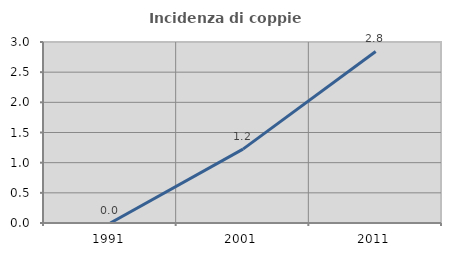
| Category | Incidenza di coppie miste |
|---|---|
| 1991.0 | 0 |
| 2001.0 | 1.224 |
| 2011.0 | 2.843 |